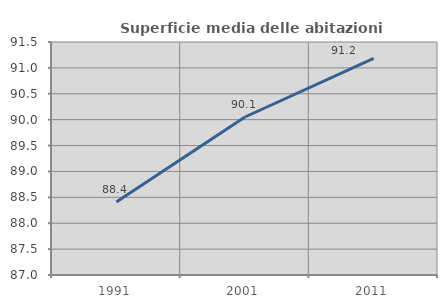
| Category | Superficie media delle abitazioni occupate |
|---|---|
| 1991.0 | 88.408 |
| 2001.0 | 90.051 |
| 2011.0 | 91.182 |